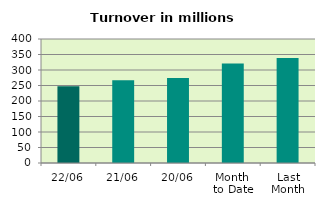
| Category | Series 0 |
|---|---|
| 22/06 | 247.332 |
| 21/06 | 266.906 |
| 20/06 | 273.948 |
| Month 
to Date | 320.683 |
| Last
Month | 338.969 |